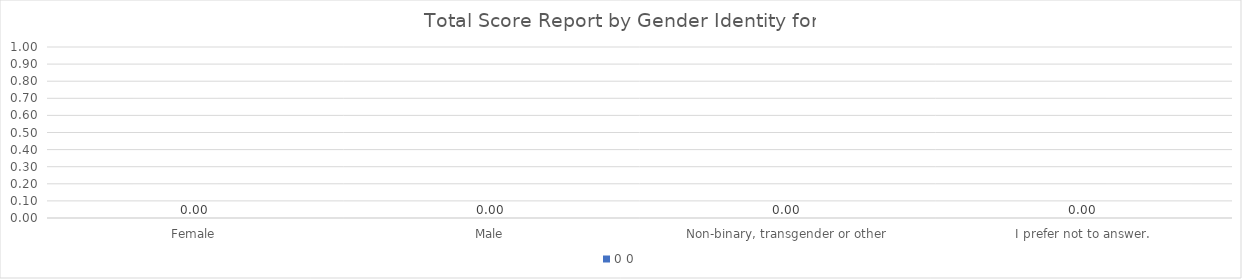
| Category | 0 |
|---|---|
| Female | 0 |
| Male | 0 |
| Non-binary, transgender or other | 0 |
| I prefer not to answer. | 0 |